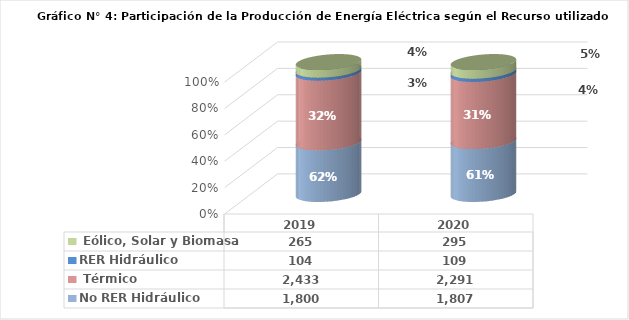
| Category | No RER | RER |
|---|---|---|
| 2019.0 | 2432.506 | 264.715 |
| 2020.0 | 2291.432 | 295.024 |